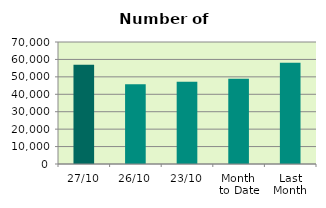
| Category | Series 0 |
|---|---|
| 27/10 | 56938 |
| 26/10 | 45694 |
| 23/10 | 47130 |
| Month 
to Date | 48858.316 |
| Last
Month | 58072.091 |